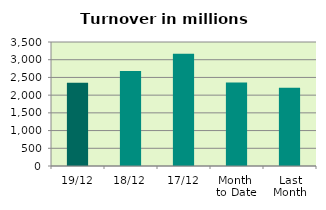
| Category | Series 0 |
|---|---|
| 19/12 | 2347.408 |
| 18/12 | 2683.205 |
| 17/12 | 3169.393 |
| Month 
to Date | 2359.054 |
| Last
Month | 2210.602 |